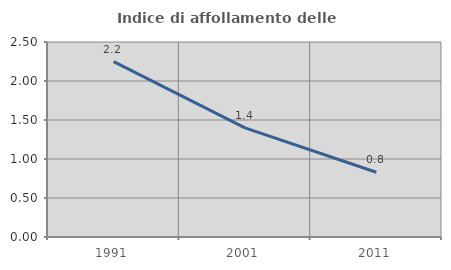
| Category | Indice di affollamento delle abitazioni  |
|---|---|
| 1991.0 | 2.249 |
| 2001.0 | 1.398 |
| 2011.0 | 0.831 |